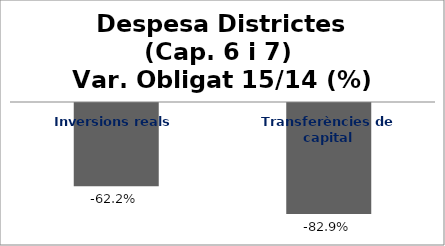
| Category | Series 0 |
|---|---|
| Inversions reals | -0.622 |
| Transferències de capital | -0.829 |